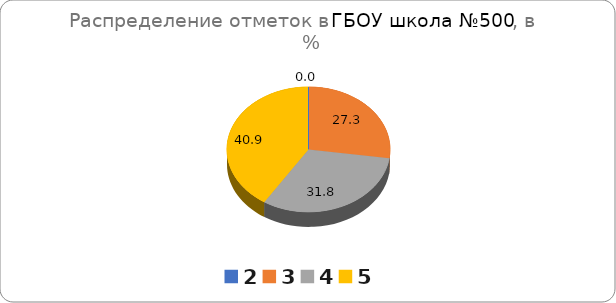
| Category | ГБОУ СОШ №500 |
|---|---|
| 2.0 | 0 |
| 3.0 | 27.27 |
| 4.0 | 31.82 |
| 5.0 | 40.91 |